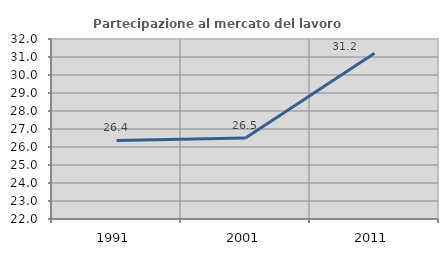
| Category | Partecipazione al mercato del lavoro  femminile |
|---|---|
| 1991.0 | 26.361 |
| 2001.0 | 26.506 |
| 2011.0 | 31.213 |